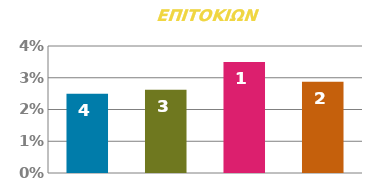
| Category | ΕΠΙΤΟΚΙΟ |
|---|---|
| 0 | 0.025 |
| 1 | 0.026 |
| 2 | 0.035 |
| 3 | 0.029 |